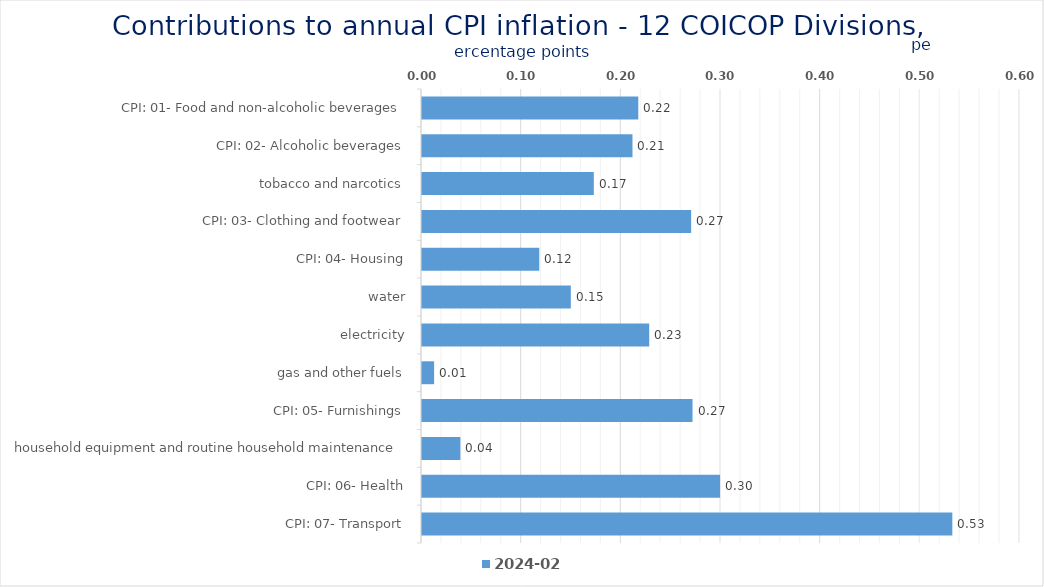
| Category | 2024-02 |
|---|---|
| CPI: 01- Food and non-alcoholic beverages | 0.217 |
| CPI: 02- Alcoholic beverages, tobacco and narcotics | 0.211 |
| CPI: 03- Clothing and footwear | 0.172 |
| CPI: 04- Housing, water, electricity, gas and other fuels | 0.27 |
| CPI: 05- Furnishings, household equipment and routine household maintenance | 0.118 |
| CPI: 06- Health | 0.149 |
| CPI: 07- Transport | 0.228 |
| CPI: 08- Communication | 0.012 |
| CPI: 09- Recreation and culture | 0.271 |
| CPI: 10- Education | 0.039 |
| CPI: 11- Restaurants and hotels | 0.299 |
| CPI: 12- Miscellaneous goods and services | 0.532 |